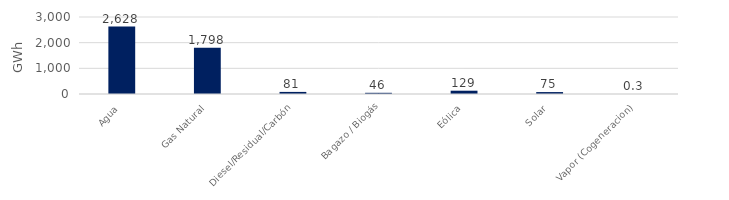
| Category | Series 0 |
|---|---|
| Agua | 2628.222 |
| Gas Natural | 1797.796 |
| Diesel/Residual/Carbón | 81.282 |
| Bagazo / Biogás | 46.472 |
| Eólica | 128.538 |
| Solar | 75.156 |
| Vapor (Cogeneracion) | 0.301 |